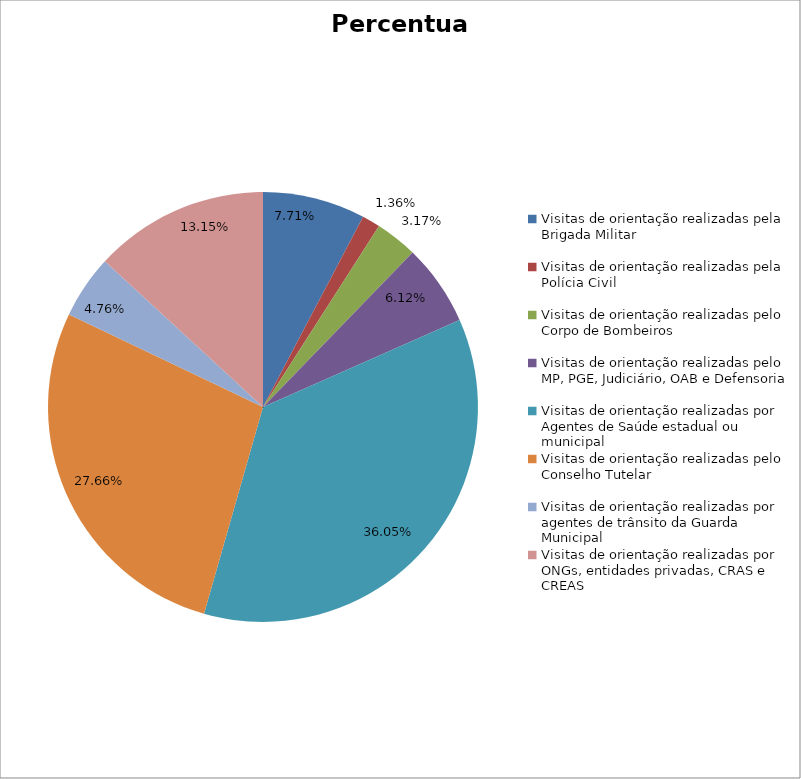
| Category | Percentual |
|---|---|
| Visitas de orientação realizadas pela Brigada Militar | 0.077 |
| Visitas de orientação realizadas pela Polícia Civil | 0.014 |
| Visitas de orientação realizadas pelo Corpo de Bombeiros | 0.032 |
| Visitas de orientação realizadas pelo MP, PGE, Judiciário, OAB e Defensoria | 0.061 |
| Visitas de orientação realizadas por Agentes de Saúde estadual ou municipal | 0.361 |
| Visitas de orientação realizadas pelo Conselho Tutelar | 0.277 |
| Visitas de orientação realizadas por agentes de trânsito da Guarda Municipal | 0.048 |
| Visitas de orientação realizadas por ONGs, entidades privadas, CRAS e CREAS | 0.132 |